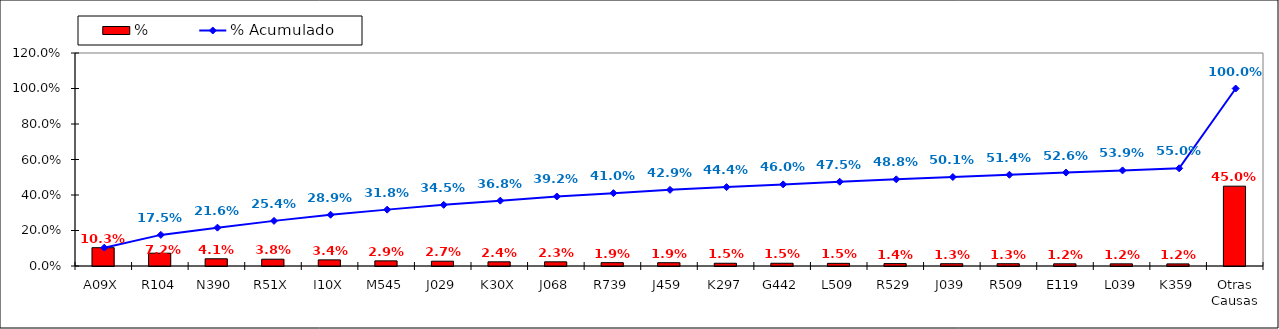
| Category | % |
|---|---|
| A09X | 0.103 |
| R104 | 0.072 |
| N390 | 0.041 |
| R51X | 0.038 |
| I10X | 0.034 |
| M545 | 0.029 |
| J029 | 0.027 |
| K30X | 0.024 |
| J068 | 0.023 |
| R739 | 0.019 |
| J459 | 0.019 |
| K297 | 0.015 |
| G442 | 0.015 |
| L509 | 0.015 |
| R529 | 0.014 |
| J039 | 0.013 |
| R509 | 0.013 |
| E119 | 0.012 |
| L039 | 0.012 |
| K359 | 0.012 |
| Otras Causas | 0.45 |